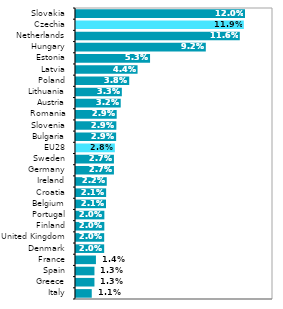
| Category | Series 0 |
|---|---|
| Italy | 0.011 |
| Greece | 0.013 |
| Spain | 0.013 |
| France | 0.014 |
| Denmark | 0.02 |
| United Kingdom | 0.02 |
| Finland | 0.02 |
| Portugal | 0.02 |
| Belgium | 0.021 |
| Croatia | 0.021 |
| Ireland | 0.022 |
| Germany | 0.027 |
| Sweden | 0.027 |
| EU28 | 0.028 |
| Bulgaria | 0.029 |
| Slovenia | 0.029 |
| Romania | 0.029 |
| Austria | 0.032 |
| Lithuania | 0.033 |
| Poland | 0.038 |
| Latvia | 0.044 |
| Estonia | 0.053 |
| Hungary | 0.092 |
| Netherlands | 0.116 |
| Czechia | 0.119 |
| Slovakia | 0.12 |